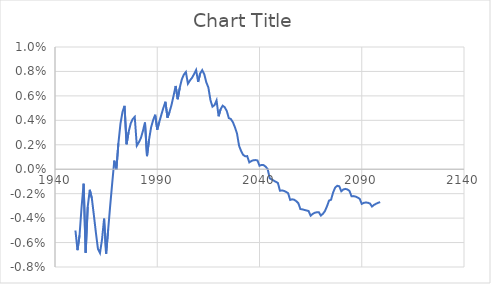
| Category | Series 0 |
|---|---|
| 1950.0 | -0.005 |
| 1951.0 | -0.007 |
| 1952.0 | -0.005 |
| 1953.0 | -0.003 |
| 1954.0 | -0.001 |
| 1955.0 | -0.007 |
| 1956.0 | -0.003 |
| 1957.0 | -0.002 |
| 1958.0 | -0.002 |
| 1959.0 | -0.004 |
| 1960.0 | -0.005 |
| 1961.0 | -0.007 |
| 1962.0 | -0.007 |
| 1963.0 | -0.006 |
| 1964.0 | -0.004 |
| 1965.0 | -0.007 |
| 1966.0 | -0.005 |
| 1967.0 | -0.003 |
| 1968.0 | -0.001 |
| 1969.0 | 0.001 |
| 1970.0 | 0 |
| 1971.0 | 0.002 |
| 1972.0 | 0.004 |
| 1973.0 | 0.005 |
| 1974.0 | 0.005 |
| 1975.0 | 0.002 |
| 1976.0 | 0.003 |
| 1977.0 | 0.004 |
| 1978.0 | 0.004 |
| 1979.0 | 0.004 |
| 1980.0 | 0.002 |
| 1981.0 | 0.002 |
| 1982.0 | 0.003 |
| 1983.0 | 0.003 |
| 1984.0 | 0.004 |
| 1985.0 | 0.001 |
| 1986.0 | 0.002 |
| 1987.0 | 0.003 |
| 1988.0 | 0.004 |
| 1989.0 | 0.004 |
| 1990.0 | 0.003 |
| 1991.0 | 0.004 |
| 1992.0 | 0.004 |
| 1993.0 | 0.005 |
| 1994.0 | 0.006 |
| 1995.0 | 0.004 |
| 1996.0 | 0.005 |
| 1997.0 | 0.005 |
| 1998.0 | 0.006 |
| 1999.0 | 0.007 |
| 2000.0 | 0.006 |
| 2001.0 | 0.007 |
| 2002.0 | 0.007 |
| 2003.0 | 0.008 |
| 2004.0 | 0.008 |
| 2005.0 | 0.007 |
| 2006.0 | 0.007 |
| 2007.0 | 0.007 |
| 2008.0 | 0.008 |
| 2009.0 | 0.008 |
| 2010.0 | 0.007 |
| 2011.0 | 0.008 |
| 2012.0 | 0.008 |
| 2013.0 | 0.008 |
| 2014.0 | 0.007 |
| 2015.0 | 0.007 |
| 2016.0 | 0.006 |
| 2017.0 | 0.005 |
| 2018.0 | 0.005 |
| 2019.0 | 0.006 |
| 2020.0 | 0.004 |
| 2021.0 | 0.005 |
| 2022.0 | 0.005 |
| 2023.0 | 0.005 |
| 2024.0 | 0.005 |
| 2025.0 | 0.004 |
| 2026.0 | 0.004 |
| 2027.0 | 0.004 |
| 2028.0 | 0.003 |
| 2029.0 | 0.003 |
| 2030.0 | 0.002 |
| 2031.0 | 0.001 |
| 2032.0 | 0.001 |
| 2033.0 | 0.001 |
| 2034.0 | 0.001 |
| 2035.0 | 0.001 |
| 2036.0 | 0.001 |
| 2037.0 | 0.001 |
| 2038.0 | 0.001 |
| 2039.0 | 0.001 |
| 2040.0 | 0 |
| 2041.0 | 0 |
| 2042.0 | 0 |
| 2043.0 | 0 |
| 2044.0 | 0 |
| 2045.0 | -0.001 |
| 2046.0 | -0.001 |
| 2047.0 | -0.001 |
| 2048.0 | -0.001 |
| 2049.0 | -0.001 |
| 2050.0 | -0.002 |
| 2051.0 | -0.002 |
| 2052.0 | -0.002 |
| 2053.0 | -0.002 |
| 2054.0 | -0.002 |
| 2055.0 | -0.003 |
| 2056.0 | -0.002 |
| 2057.0 | -0.002 |
| 2058.0 | -0.003 |
| 2059.0 | -0.003 |
| 2060.0 | -0.003 |
| 2061.0 | -0.003 |
| 2062.0 | -0.003 |
| 2063.0 | -0.003 |
| 2064.0 | -0.003 |
| 2065.0 | -0.004 |
| 2066.0 | -0.004 |
| 2067.0 | -0.004 |
| 2068.0 | -0.004 |
| 2069.0 | -0.004 |
| 2070.0 | -0.004 |
| 2071.0 | -0.004 |
| 2072.0 | -0.003 |
| 2073.0 | -0.003 |
| 2074.0 | -0.003 |
| 2075.0 | -0.002 |
| 2076.0 | -0.002 |
| 2077.0 | -0.002 |
| 2078.0 | -0.001 |
| 2079.0 | -0.001 |
| 2080.0 | -0.002 |
| 2081.0 | -0.002 |
| 2082.0 | -0.002 |
| 2083.0 | -0.002 |
| 2084.0 | -0.002 |
| 2085.0 | -0.002 |
| 2086.0 | -0.002 |
| 2087.0 | -0.002 |
| 2088.0 | -0.002 |
| 2089.0 | -0.002 |
| 2090.0 | -0.003 |
| 2091.0 | -0.003 |
| 2092.0 | -0.003 |
| 2093.0 | -0.003 |
| 2094.0 | -0.003 |
| 2095.0 | -0.003 |
| 2096.0 | -0.003 |
| 2097.0 | -0.003 |
| 2098.0 | -0.003 |
| 2099.0 | -0.003 |